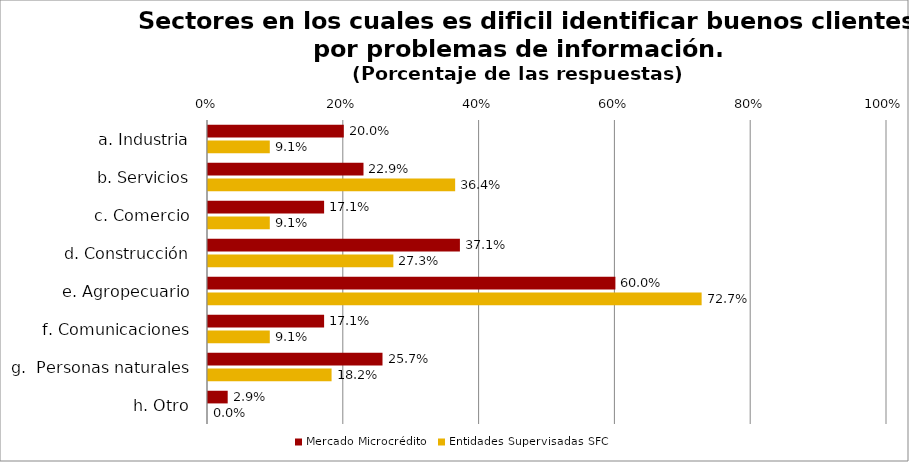
| Category | Mercado Microcrédito | Entidades Supervisadas SFC |
|---|---|---|
| a. Industria | 0.2 | 0.091 |
| b. Servicios | 0.229 | 0.364 |
| c. Comercio | 0.171 | 0.091 |
| d. Construcción | 0.371 | 0.273 |
| e. Agropecuario | 0.6 | 0.727 |
| f. Comunicaciones | 0.171 | 0.091 |
| g.  Personas naturales | 0.257 | 0.182 |
| h. Otro | 0.029 | 0 |